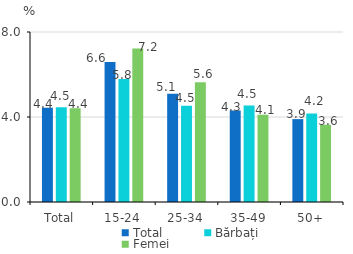
| Category | Total | Bărbați | Femei |
|---|---|---|---|
| Total | 4.432 | 4.458 | 4.408 |
| 15-24 | 6.591 | 5.788 | 7.227 |
| 25-34 | 5.096 | 4.529 | 5.634 |
| 35-49 | 4.306 | 4.537 | 4.101 |
| 50+ | 3.901 | 4.168 | 3.636 |